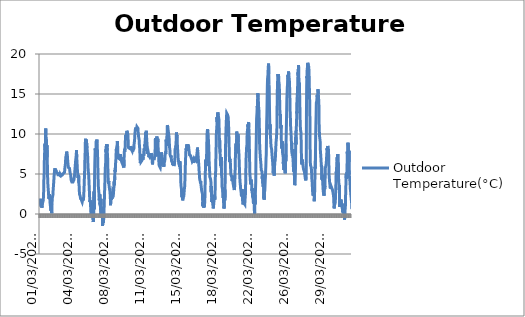
| Category | Outdoor Temperature(°C) |
|---|---|
|  01/03/2022 00:20:09 | 1.6 |
|  01/03/2022 00:50:09 | 1.9 |
|  01/03/2022 01:20:09 | 2 |
|  01/03/2022 01:50:09 | 1.2 |
|  01/03/2022 02:20:09 | 1.7 |
|  01/03/2022 02:50:09 | 0.9 |
|  01/03/2022 03:20:09 | 1.4 |
|  01/03/2022 03:50:09 | 1.4 |
|  01/03/2022 04:20:09 | 0.8 |
|  01/03/2022 04:50:09 | 0.9 |
|  01/03/2022 05:20:09 | 1 |
|  01/03/2022 05:50:09 | 1.1 |
|  01/03/2022 06:20:09 | 1.4 |
|  01/03/2022 06:50:09 | 1.4 |
|  01/03/2022 07:20:09 | 1.5 |
|  01/03/2022 07:50:09 | 1.7 |
|  01/03/2022 08:20:09 | 2.2 |
|  01/03/2022 08:50:09 | 2.9 |
|  01/03/2022 09:20:09 | 4.4 |
|  01/03/2022 09:50:09 | 4.8 |
|  01/03/2022 10:20:09 | 6.6 |
|  01/03/2022 10:50:09 | 7 |
|  01/03/2022 11:20:09 | 8.3 |
|  01/03/2022 11:50:09 | 8.8 |
|  01/03/2022 12:20:09 | 8.8 |
|  01/03/2022 12:50:09 | 8 |
|  01/03/2022 15:54:06 | 9.6 |
|  01/03/2022 16:24:06 | 10.7 |
|  01/03/2022 16:54:06 | 8.3 |
|  01/03/2022 17:24:06 | 9.3 |
|  01/03/2022 17:54:06 | 8.6 |
|  01/03/2022 18:24:06 | 8.1 |
|  01/03/2022 18:54:06 | 8.3 |
|  01/03/2022 19:24:06 | 8.6 |
|  01/03/2022 19:54:06 | 7.1 |
|  01/03/2022 20:24:06 | 5.5 |
|  01/03/2022 20:54:06 | 4.3 |
|  01/03/2022 21:24:06 | 3.7 |
|  01/03/2022 21:54:06 | 3.3 |
|  01/03/2022 22:24:06 | 3 |
|  01/03/2022 22:54:06 | 2.5 |
|  01/03/2022 23:24:06 | 2.2 |
|  01/03/2022 23:54:06 | 1.9 |
|  02/03/2022 00:24:06 | 1.8 |
|  02/03/2022 00:54:06 | 1.8 |
|  02/03/2022 01:24:06 | 2.5 |
|  02/03/2022 01:54:06 | 1.9 |
|  02/03/2022 02:24:06 | 2 |
|  02/03/2022 02:54:06 | 1.2 |
|  02/03/2022 03:24:06 | 1.2 |
|  02/03/2022 03:54:06 | 0.8 |
|  02/03/2022 04:24:06 | 0.8 |
|  02/03/2022 04:54:06 | 0.4 |
|  02/03/2022 05:24:06 | 1.2 |
|  02/03/2022 05:54:06 | 0.7 |
|  02/03/2022 06:24:06 | 0.1 |
|  02/03/2022 06:54:06 | 1.2 |
|  02/03/2022 07:24:06 | 1.5 |
|  02/03/2022 07:54:06 | 2 |
|  02/03/2022 08:24:06 | 1.9 |
|  02/03/2022 08:54:06 | 2 |
|  02/03/2022 09:24:06 | 2.4 |
|  02/03/2022 09:54:06 | 3 |
|  02/03/2022 10:24:06 | 3 |
|  02/03/2022 10:54:06 | 3.7 |
|  02/03/2022 11:24:06 | 4.2 |
|  02/03/2022 11:54:06 | 4.4 |
|  02/03/2022 12:24:06 | 5 |
|  02/03/2022 12:54:06 | 5.2 |
|  02/03/2022 13:24:06 | 5.5 |
|  02/03/2022 13:54:06 | 5.3 |
|  02/03/2022 14:24:06 | 5.7 |
|  02/03/2022 14:54:06 | 5.5 |
|  02/03/2022 15:24:06 | 5.4 |
|  02/03/2022 15:54:06 | 5.5 |
|  02/03/2022 16:24:06 | 5.5 |
|  02/03/2022 16:54:06 | 5.5 |
|  02/03/2022 17:24:06 | 5.4 |
|  02/03/2022 17:54:06 | 5.2 |
|  02/03/2022 18:24:06 | 5.3 |
|  02/03/2022 18:54:06 | 5.3 |
|  02/03/2022 19:24:06 | 5.3 |
|  02/03/2022 19:54:06 | 5.1 |
|  02/03/2022 20:24:06 | 5.1 |
|  02/03/2022 20:54:06 | 5 |
|  02/03/2022 21:24:06 | 4.9 |
|  02/03/2022 21:54:06 | 5 |
|  02/03/2022 22:24:06 | 5 |
|  02/03/2022 22:54:06 | 5 |
|  02/03/2022 23:24:06 | 5 |
|  02/03/2022 23:54:06 | 4.9 |
|  03/03/2022 00:24:06 | 4.9 |
|  03/03/2022 00:54:06 | 5 |
|  03/03/2022 01:24:06 | 4.9 |
|  03/03/2022 01:54:06 | 4.8 |
|  03/03/2022 02:24:06 | 4.8 |
|  03/03/2022 02:54:06 | 5 |
|  03/03/2022 03:24:06 | 5 |
|  03/03/2022 03:54:06 | 5 |
|  03/03/2022 04:24:06 | 5 |
|  03/03/2022 04:54:06 | 4.9 |
|  03/03/2022 05:24:06 | 4.8 |
|  03/03/2022 05:54:06 | 4.9 |
|  03/03/2022 06:24:06 | 4.9 |
|  03/03/2022 06:54:06 | 4.8 |
|  03/03/2022 07:24:06 | 4.8 |
|  03/03/2022 07:54:06 | 4.9 |
|  03/03/2022 08:24:06 | 4.9 |
|  03/03/2022 08:54:06 | 4.8 |
|  03/03/2022 09:24:06 | 4.9 |
|  03/03/2022 09:54:06 | 5 |
|  03/03/2022 10:24:06 | 5.1 |
|  03/03/2022 10:54:06 | 5.1 |
|  03/03/2022 11:24:06 | 5.1 |
|  03/03/2022 11:54:06 | 5 |
|  03/03/2022 12:24:06 | 5.2 |
|  03/03/2022 12:54:06 | 5.2 |
|  03/03/2022 13:24:06 | 5.5 |
|  03/03/2022 13:54:06 | 5.8 |
|  03/03/2022 14:24:06 | 6 |
|  03/03/2022 14:54:06 | 6.2 |
|  03/03/2022 15:24:06 | 6.6 |
|  03/03/2022 15:54:06 | 7.1 |
|  03/03/2022 16:24:06 | 7.1 |
|  03/03/2022 16:54:06 | 7.3 |
|  03/03/2022 17:24:06 | 7.5 |
|  03/03/2022 17:54:06 | 7.8 |
|  03/03/2022 18:24:06 | 7.8 |
|  03/03/2022 18:54:06 | 7.6 |
|  03/03/2022 19:24:06 | 7.5 |
|  03/03/2022 19:54:06 | 7.2 |
|  03/03/2022 20:24:06 | 6.7 |
|  03/03/2022 20:54:06 | 6.4 |
|  03/03/2022 21:24:06 | 6.1 |
|  03/03/2022 21:54:06 | 6 |
|  03/03/2022 22:24:06 | 5.8 |
|  03/03/2022 22:54:06 | 5.9 |
|  03/03/2022 23:24:06 | 5.9 |
|  03/03/2022 23:54:06 | 5.7 |
|  04/03/2022 00:24:06 | 5.8 |
|  04/03/2022 00:54:06 | 5.7 |
|  04/03/2022 01:24:06 | 5.4 |
|  04/03/2022 01:54:06 | 5.3 |
|  04/03/2022 02:24:06 | 5.1 |
|  04/03/2022 02:54:06 | 5 |
|  04/03/2022 03:24:06 | 4.9 |
|  04/03/2022 03:54:06 | 4.9 |
|  04/03/2022 04:24:06 | 4.4 |
|  04/03/2022 04:54:06 | 4.2 |
|  04/03/2022 05:24:06 | 4.2 |
|  04/03/2022 05:54:06 | 4.2 |
|  04/03/2022 06:24:06 | 4 |
|  04/03/2022 06:54:06 | 4.1 |
|  04/03/2022 07:24:06 | 4 |
|  04/03/2022 07:54:06 | 3.9 |
|  04/03/2022 08:24:06 | 4.1 |
|  04/03/2022 08:54:06 | 4 |
|  04/03/2022 09:24:06 | 4.1 |
|  04/03/2022 09:54:06 | 4 |
|  04/03/2022 10:24:06 | 4 |
|  04/03/2022 10:54:06 | 4.1 |
|  04/03/2022 11:24:06 | 4.3 |
|  04/03/2022 11:54:06 | 4.5 |
|  04/03/2022 12:24:06 | 4.7 |
|  04/03/2022 12:54:06 | 5 |
|  04/03/2022 13:24:06 | 5.4 |
|  04/03/2022 13:54:06 | 5.6 |
|  04/03/2022 14:24:06 | 6.1 |
|  04/03/2022 14:54:06 | 6.3 |
|  04/03/2022 15:24:06 | 6.7 |
|  04/03/2022 15:54:06 | 6.9 |
|  04/03/2022 16:24:06 | 7 |
|  04/03/2022 16:54:06 | 7.4 |
|  04/03/2022 17:24:06 | 8 |
|  04/03/2022 17:54:06 | 7.1 |
|  04/03/2022 18:24:06 | 6.7 |
|  04/03/2022 18:54:06 | 6.2 |
|  04/03/2022 19:24:06 | 5.6 |
|  04/03/2022 19:54:06 | 5.3 |
|  04/03/2022 20:24:06 | 4.9 |
|  04/03/2022 20:54:06 | 4.5 |
|  04/03/2022 21:24:06 | 4.5 |
|  04/03/2022 21:54:06 | 4.4 |
|  04/03/2022 22:24:06 | 4.9 |
|  04/03/2022 22:54:06 | 3.9 |
|  04/03/2022 23:24:06 | 3.6 |
|  04/03/2022 23:54:06 | 3.4 |
|  05/03/2022 00:24:06 | 2.5 |
|  05/03/2022 00:54:06 | 2.6 |
|  05/03/2022 01:24:06 | 2.5 |
|  05/03/2022 01:54:06 | 2.3 |
|  05/03/2022 02:24:06 | 2.2 |
|  05/03/2022 02:54:06 | 2 |
|  05/03/2022 03:24:06 | 1.9 |
|  05/03/2022 03:54:06 | 1.8 |
|  05/03/2022 04:24:06 | 1.8 |
|  05/03/2022 04:54:06 | 2 |
|  05/03/2022 05:24:06 | 1.7 |
|  05/03/2022 05:54:06 | 1.8 |
|  05/03/2022 06:24:06 | 1.6 |
|  05/03/2022 06:54:06 | 1.5 |
|  05/03/2022 07:24:06 | 1.4 |
|  05/03/2022 07:54:06 | 1.4 |
|  05/03/2022 08:24:06 | 1.9 |
|  05/03/2022 08:54:06 | 1.8 |
|  05/03/2022 09:24:06 | 1.7 |
|  05/03/2022 09:54:06 | 1.9 |
|  05/03/2022 10:24:06 | 2.1 |
|  05/03/2022 10:54:06 | 2.7 |
|  05/03/2022 11:24:06 | 3.3 |
|  05/03/2022 11:54:06 | 4.1 |
|  05/03/2022 12:24:06 | 4.8 |
|  05/03/2022 12:54:06 | 5.7 |
|  05/03/2022 13:24:06 | 7 |
|  05/03/2022 13:54:06 | 7.6 |
|  05/03/2022 14:24:06 | 8.9 |
|  05/03/2022 14:54:06 | 9.4 |
|  05/03/2022 15:24:06 | 9.3 |
|  05/03/2022 15:54:06 | 8.1 |
|  05/03/2022 16:24:06 | 8.5 |
|  05/03/2022 16:54:06 | 9.3 |
|  05/03/2022 17:24:06 | 9.2 |
|  05/03/2022 17:54:06 | 9.2 |
|  05/03/2022 18:24:06 | 8.2 |
|  05/03/2022 18:54:06 | 8.2 |
|  05/03/2022 19:24:06 | 7.6 |
|  05/03/2022 19:54:06 | 7.2 |
|  05/03/2022 20:24:06 | 6.4 |
|  05/03/2022 20:54:06 | 5.8 |
|  05/03/2022 21:24:06 | 5.3 |
|  05/03/2022 21:54:06 | 5.1 |
|  05/03/2022 22:24:06 | 4.8 |
|  05/03/2022 22:54:06 | 4.2 |
|  05/03/2022 23:24:06 | 3.6 |
|  05/03/2022 23:54:06 | 3 |
|  06/03/2022 00:24:06 | 2.4 |
|  06/03/2022 00:54:06 | 1.7 |
|  06/03/2022 01:24:06 | 1.5 |
|  06/03/2022 01:54:06 | 1.7 |
|  06/03/2022 02:24:06 | 1.5 |
|  06/03/2022 02:54:06 | 1.5 |
|  06/03/2022 03:24:06 | 0.4 |
|  06/03/2022 03:54:06 | 0 |
|  06/03/2022 04:24:06 | 0 |
|  06/03/2022 04:54:06 | 0 |
|  06/03/2022 05:24:06 | 0.2 |
|  06/03/2022 05:54:06 | 1.4 |
|  06/03/2022 06:24:06 | -0.1 |
|  06/03/2022 06:54:06 | -0.5 |
|  06/03/2022 07:24:06 | -0.4 |
|  06/03/2022 07:54:06 | -0.2 |
|  06/03/2022 08:24:06 | -0.3 |
|  06/03/2022 08:54:06 | -0.7 |
|  06/03/2022 09:24:06 | -1 |
|  06/03/2022 09:54:06 | -0.4 |
|  06/03/2022 10:24:06 | 0.2 |
|  06/03/2022 10:54:06 | 2.8 |
|  06/03/2022 11:24:06 | 0.6 |
|  06/03/2022 11:54:06 | 2.3 |
|  06/03/2022 12:24:06 | 4.8 |
|  06/03/2022 12:54:06 | 6.3 |
|  06/03/2022 13:24:06 | 7.3 |
|  06/03/2022 13:54:06 | 8.2 |
|  06/03/2022 14:24:06 | 8.3 |
|  06/03/2022 14:54:06 | 7.6 |
|  06/03/2022 15:24:06 | 7.8 |
|  06/03/2022 15:54:06 | 7.3 |
|  06/03/2022 16:24:06 | 9.1 |
|  06/03/2022 16:54:06 | 9.1 |
|  06/03/2022 17:24:06 | 9.2 |
|  06/03/2022 17:54:06 | 9.3 |
|  06/03/2022 18:24:06 | 8.8 |
|  06/03/2022 18:54:06 | 8.7 |
|  06/03/2022 19:24:06 | 7.6 |
|  06/03/2022 19:54:06 | 6.5 |
|  06/03/2022 20:24:06 | 5.3 |
|  06/03/2022 20:54:06 | 4.1 |
|  06/03/2022 21:24:06 | 3.4 |
|  06/03/2022 21:54:06 | 3.1 |
|  06/03/2022 22:24:06 | 3.1 |
|  06/03/2022 22:54:06 | 2.5 |
|  06/03/2022 23:24:06 | 1.7 |
|  06/03/2022 23:54:06 | 2 |
|  07/03/2022 00:24:06 | 2.3 |
|  07/03/2022 00:54:06 | 2.5 |
|  07/03/2022 01:24:06 | 1.2 |
|  07/03/2022 01:54:06 | 1.4 |
|  07/03/2022 02:24:06 | 0.5 |
|  07/03/2022 02:54:06 | 1.5 |
|  07/03/2022 03:24:06 | 1.9 |
|  07/03/2022 03:54:06 | -0.4 |
|  07/03/2022 04:24:06 | 0.5 |
|  07/03/2022 04:54:06 | -0.3 |
|  07/03/2022 05:24:06 | 0.7 |
|  07/03/2022 05:54:06 | 0.9 |
|  07/03/2022 06:24:06 | 0.8 |
|  07/03/2022 06:54:06 | -0.4 |
|  07/03/2022 07:24:06 | -1.5 |
|  07/03/2022 07:54:06 | -0.8 |
|  07/03/2022 08:24:06 | -0.6 |
|  07/03/2022 08:54:06 | -1.1 |
|  07/03/2022 09:24:06 | -1 |
|  07/03/2022 09:54:06 | -0.7 |
|  07/03/2022 10:24:06 | -0.3 |
|  07/03/2022 10:54:06 | 0.5 |
|  07/03/2022 11:24:06 | 1.5 |
|  07/03/2022 11:54:06 | 2.1 |
|  07/03/2022 12:24:06 | 3.3 |
|  07/03/2022 12:54:06 | 4 |
|  07/03/2022 13:24:06 | 5.1 |
|  07/03/2022 13:54:06 | 5.8 |
|  07/03/2022 14:24:06 | 6.2 |
|  07/03/2022 14:54:06 | 6.5 |
|  07/03/2022 15:24:06 | 8.1 |
|  07/03/2022 15:54:06 | 7.7 |
|  07/03/2022 16:24:06 | 8.5 |
|  07/03/2022 16:54:06 | 8.7 |
|  07/03/2022 17:24:06 | 8.4 |
|  07/03/2022 17:54:06 | 8.7 |
|  07/03/2022 18:24:06 | 7.9 |
|  07/03/2022 18:54:06 | 7.5 |
|  07/03/2022 19:24:06 | 7 |
|  07/03/2022 19:54:06 | 5.8 |
|  07/03/2022 20:24:06 | 4.7 |
|  07/03/2022 20:54:06 | 4.2 |
|  07/03/2022 21:24:06 | 3.8 |
|  07/03/2022 21:54:06 | 4.1 |
|  07/03/2022 22:24:06 | 3.8 |
|  07/03/2022 22:54:06 | 3.7 |
|  07/03/2022 23:24:06 | 3.3 |
|  07/03/2022 23:54:06 | 3.3 |
|  08/03/2022 00:24:06 | 3.2 |
|  08/03/2022 00:54:06 | 2.8 |
|  08/03/2022 01:24:06 | 2.4 |
|  08/03/2022 01:54:06 | 1.9 |
|  08/03/2022 02:24:06 | 1.1 |
|  08/03/2022 02:54:06 | 2 |
|  08/03/2022 03:24:06 | 2.4 |
|  08/03/2022 03:54:06 | 2.4 |
|  08/03/2022 04:24:06 | 1.8 |
|  08/03/2022 04:54:06 | 2.2 |
|  08/03/2022 05:24:06 | 2.2 |
|  08/03/2022 05:54:06 | 1.9 |
|  08/03/2022 06:24:06 | 2.3 |
|  08/03/2022 06:54:06 | 2.3 |
|  08/03/2022 07:24:06 | 2.9 |
|  08/03/2022 07:54:06 | 2.9 |
|  08/03/2022 08:24:06 | 2.8 |
|  08/03/2022 08:54:06 | 2.8 |
|  08/03/2022 09:24:06 | 2.7 |
|  08/03/2022 09:54:06 | 2.7 |
|  08/03/2022 10:24:06 | 3.4 |
|  08/03/2022 10:54:06 | 4.1 |
|  08/03/2022 11:24:06 | 3.6 |
|  08/03/2022 11:54:06 | 3.7 |
|  08/03/2022 12:24:06 | 4.7 |
|  08/03/2022 12:54:06 | 5.5 |
|  08/03/2022 13:24:06 | 5.3 |
|  08/03/2022 13:54:06 | 5.9 |
|  08/03/2022 14:24:06 | 6.4 |
|  08/03/2022 14:54:06 | 6.7 |
|  08/03/2022 15:24:06 | 7.3 |
|  08/03/2022 15:54:06 | 8.1 |
|  08/03/2022 16:24:06 | 7.9 |
|  08/03/2022 16:54:06 | 8.3 |
|  08/03/2022 17:24:06 | 8.4 |
|  08/03/2022 17:54:06 | 8.6 |
|  08/03/2022 18:24:06 | 9.1 |
|  08/03/2022 18:54:06 | 8.9 |
|  08/03/2022 19:24:06 | 8.1 |
|  08/03/2022 19:54:06 | 7.4 |
|  08/03/2022 20:24:06 | 7.3 |
|  08/03/2022 20:54:06 | 7 |
|  08/03/2022 21:24:06 | 7.1 |
|  08/03/2022 21:54:06 | 7.1 |
|  08/03/2022 22:24:06 | 7.1 |
|  08/03/2022 22:54:06 | 7 |
|  08/03/2022 23:24:06 | 6.9 |
|  08/03/2022 23:54:06 | 6.9 |
|  09/03/2022 00:24:06 | 7.3 |
|  09/03/2022 00:54:06 | 7 |
|  09/03/2022 01:24:06 | 7.2 |
|  09/03/2022 01:54:06 | 7.5 |
|  09/03/2022 02:24:06 | 7.2 |
|  09/03/2022 02:54:06 | 6.9 |
|  09/03/2022 03:24:06 | 7.1 |
|  09/03/2022 03:54:06 | 6.7 |
|  09/03/2022 04:24:06 | 6.6 |
|  09/03/2022 04:54:06 | 6.5 |
|  09/03/2022 05:24:06 | 6.5 |
|  09/03/2022 05:54:06 | 6.5 |
|  09/03/2022 06:24:06 | 6.3 |
|  09/03/2022 06:54:06 | 6.4 |
|  09/03/2022 07:24:06 | 6.5 |
|  09/03/2022 07:54:06 | 6.3 |
|  09/03/2022 08:24:06 | 6.4 |
|  09/03/2022 08:54:06 | 6.5 |
|  09/03/2022 09:24:06 | 6.2 |
|  09/03/2022 09:54:06 | 5.8 |
|  09/03/2022 10:24:06 | 6.8 |
|  09/03/2022 10:54:06 | 7.5 |
|  09/03/2022 11:24:06 | 8.1 |
|  09/03/2022 11:54:06 | 7.8 |
|  09/03/2022 12:24:06 | 7.7 |
|  09/03/2022 12:54:06 | 8.2 |
|  09/03/2022 13:24:06 | 8.3 |
|  09/03/2022 13:54:06 | 9.7 |
|  09/03/2022 14:24:06 | 9.9 |
|  09/03/2022 14:54:06 | 9.8 |
|  09/03/2022 15:24:06 | 9.6 |
|  09/03/2022 15:54:06 | 9.9 |
|  09/03/2022 16:24:06 | 10.1 |
|  09/03/2022 16:54:06 | 10.4 |
|  09/03/2022 17:24:06 | 10.5 |
|  09/03/2022 17:54:06 | 10.5 |
|  09/03/2022 18:24:06 | 10.4 |
|  09/03/2022 18:54:06 | 10.1 |
|  09/03/2022 19:24:06 | 10 |
|  09/03/2022 19:54:06 | 9.8 |
|  09/03/2022 20:24:06 | 8.6 |
|  09/03/2022 20:54:06 | 8.3 |
|  09/03/2022 21:24:06 | 8.3 |
|  09/03/2022 21:54:06 | 8.3 |
|  09/03/2022 22:24:06 | 8.3 |
|  09/03/2022 22:54:06 | 8.4 |
|  09/03/2022 23:24:06 | 8.2 |
|  09/03/2022 23:54:06 | 8.2 |
|  10/03/2022 00:24:06 | 8.2 |
|  10/03/2022 00:54:06 | 8.3 |
|  10/03/2022 01:24:06 | 8.3 |
|  10/03/2022 01:54:06 | 8.3 |
|  10/03/2022 02:24:06 | 8.5 |
|  10/03/2022 02:54:06 | 8.6 |
|  10/03/2022 03:24:06 | 8.1 |
|  10/03/2022 03:54:06 | 8.1 |
|  10/03/2022 04:24:06 | 8.2 |
|  10/03/2022 04:54:06 | 8 |
|  10/03/2022 05:24:06 | 7.9 |
|  10/03/2022 05:54:06 | 8.1 |
|  10/03/2022 06:24:06 | 8.2 |
|  10/03/2022 06:54:06 | 8.1 |
|  10/03/2022 07:24:06 | 8 |
|  10/03/2022 07:54:06 | 8.1 |
|  10/03/2022 08:24:06 | 8 |
|  10/03/2022 08:54:06 | 8.1 |
|  10/03/2022 09:24:06 | 8 |
|  10/03/2022 09:54:06 | 8.2 |
|  10/03/2022 10:24:06 | 8.8 |
|  10/03/2022 10:54:06 | 9 |
|  10/03/2022 11:24:06 | 9.2 |
|  10/03/2022 11:54:06 | 9.7 |
|  10/03/2022 12:24:06 | 9.8 |
|  10/03/2022 12:54:06 | 10.4 |
|  10/03/2022 13:24:06 | 10.6 |
|  10/03/2022 13:54:06 | 10.8 |
|  10/03/2022 14:24:06 | 10.5 |
|  10/03/2022 14:54:06 | 10.7 |
|  10/03/2022 15:24:06 | 10.4 |
|  10/03/2022 15:54:06 | 10.6 |
|  10/03/2022 16:24:06 | 10.5 |
|  10/03/2022 16:54:06 | 10.9 |
|  10/03/2022 17:24:06 | 10.9 |
|  10/03/2022 17:54:06 | 11 |
|  10/03/2022 18:24:06 | 10.9 |
|  10/03/2022 18:54:06 | 10.8 |
|  10/03/2022 19:24:06 | 10.7 |
|  10/03/2022 19:54:06 | 10.2 |
|  10/03/2022 20:24:06 | 10 |
|  10/03/2022 20:54:06 | 9.7 |
|  10/03/2022 21:24:06 | 9.7 |
|  10/03/2022 21:54:06 | 9.8 |
|  10/03/2022 22:24:06 | 9.2 |
|  10/03/2022 22:54:06 | 8.6 |
|  10/03/2022 23:24:06 | 8.3 |
|  10/03/2022 23:54:06 | 7.8 |
|  11/03/2022 00:24:06 | 7 |
|  11/03/2022 00:54:06 | 6.4 |
|  11/03/2022 01:24:06 | 6.5 |
|  11/03/2022 01:54:06 | 6.7 |
|  11/03/2022 02:24:06 | 6.5 |
|  11/03/2022 02:54:06 | 6.4 |
|  11/03/2022 03:24:06 | 6.5 |
|  11/03/2022 03:54:06 | 6.6 |
|  11/03/2022 04:24:06 | 6.5 |
|  11/03/2022 04:54:06 | 6.7 |
|  11/03/2022 05:24:06 | 6.6 |
|  11/03/2022 05:54:06 | 7.5 |
|  11/03/2022 06:24:06 | 7.1 |
|  11/03/2022 06:54:06 | 7 |
|  11/03/2022 07:24:06 | 6.8 |
|  11/03/2022 07:54:06 | 7.1 |
|  11/03/2022 08:24:06 | 7.5 |
|  11/03/2022 08:54:06 | 7.6 |
|  11/03/2022 09:24:06 | 7.3 |
|  11/03/2022 09:54:06 | 7.9 |
|  11/03/2022 10:24:06 | 8.2 |
|  11/03/2022 10:54:06 | 7.9 |
|  11/03/2022 11:24:06 | 8.1 |
|  11/03/2022 11:54:06 | 8.7 |
|  11/03/2022 12:24:06 | 8.5 |
|  11/03/2022 12:54:06 | 9.1 |
|  11/03/2022 13:24:06 | 10.2 |
|  11/03/2022 13:54:06 | 10.1 |
|  11/03/2022 14:24:06 | 9.2 |
|  11/03/2022 14:54:06 | 9.5 |
|  11/03/2022 15:24:06 | 10.4 |
|  11/03/2022 15:54:06 | 9.7 |
|  11/03/2022 16:24:06 | 9.2 |
|  11/03/2022 16:54:06 | 8.8 |
|  11/03/2022 17:24:06 | 8.4 |
|  11/03/2022 17:54:06 | 7.9 |
|  11/03/2022 18:24:06 | 7.5 |
|  11/03/2022 18:54:06 | 7.4 |
|  11/03/2022 19:24:06 | 7.6 |
|  11/03/2022 19:54:06 | 7.7 |
|  11/03/2022 20:24:06 | 7.6 |
|  11/03/2022 20:54:06 | 7.4 |
|  11/03/2022 21:24:06 | 7.1 |
|  11/03/2022 21:54:06 | 7.3 |
|  11/03/2022 22:24:06 | 7.3 |
|  11/03/2022 22:54:06 | 7.2 |
|  11/03/2022 23:24:06 | 7.2 |
|  11/03/2022 23:54:06 | 7.1 |
|  12/03/2022 00:24:06 | 7.2 |
|  12/03/2022 00:54:06 | 7.2 |
|  12/03/2022 01:24:06 | 7.2 |
|  12/03/2022 01:54:06 | 7.3 |
|  12/03/2022 02:24:06 | 7.3 |
|  12/03/2022 02:54:06 | 7.6 |
|  12/03/2022 03:24:06 | 7.6 |
|  12/03/2022 03:54:06 | 7.4 |
|  12/03/2022 04:24:06 | 7.2 |
|  12/03/2022 04:54:06 | 7 |
|  12/03/2022 05:24:06 | 6.6 |
|  12/03/2022 05:54:06 | 6.2 |
|  12/03/2022 06:24:06 | 6.4 |
|  12/03/2022 06:54:06 | 6.9 |
|  12/03/2022 07:24:06 | 7.1 |
|  12/03/2022 07:54:06 | 6.9 |
|  12/03/2022 08:24:06 | 7 |
|  12/03/2022 08:54:06 | 7 |
|  12/03/2022 09:24:06 | 6.8 |
|  12/03/2022 09:54:06 | 7 |
|  12/03/2022 10:24:06 | 6.9 |
|  12/03/2022 10:54:06 | 7 |
|  12/03/2022 11:24:06 | 7.3 |
|  12/03/2022 11:54:06 | 7.7 |
|  12/03/2022 12:24:06 | 8.2 |
|  12/03/2022 12:54:06 | 9.5 |
|  12/03/2022 13:24:06 | 9.4 |
|  12/03/2022 13:54:06 | 7.9 |
|  12/03/2022 14:24:06 | 7.6 |
|  12/03/2022 14:54:06 | 7.2 |
|  12/03/2022 15:24:06 | 7.3 |
|  12/03/2022 15:54:06 | 8.6 |
|  12/03/2022 16:24:06 | 9.7 |
|  12/03/2022 16:54:06 | 9.1 |
|  12/03/2022 17:24:06 | 8.6 |
|  12/03/2022 17:54:06 | 8.4 |
|  12/03/2022 18:24:06 | 9.4 |
|  12/03/2022 18:54:06 | 9 |
|  12/03/2022 19:24:06 | 8.3 |
|  12/03/2022 19:54:06 | 8.4 |
|  12/03/2022 20:24:06 | 7.5 |
|  12/03/2022 20:54:06 | 6.9 |
|  12/03/2022 21:24:06 | 6.2 |
|  12/03/2022 21:54:06 | 6.1 |
|  12/03/2022 22:24:06 | 6 |
|  12/03/2022 22:54:06 | 5.9 |
|  12/03/2022 23:24:06 | 6 |
|  12/03/2022 23:54:06 | 5.9 |
|  13/03/2022 00:24:06 | 5.8 |
|  13/03/2022 00:54:06 | 5.8 |
|  13/03/2022 01:24:06 | 6.3 |
|  13/03/2022 01:54:06 | 6.5 |
|  13/03/2022 02:24:06 | 7.5 |
|  13/03/2022 02:54:06 | 7.7 |
|  13/03/2022 03:24:06 | 7.8 |
|  13/03/2022 03:54:06 | 7.5 |
|  13/03/2022 04:24:06 | 7.4 |
|  13/03/2022 04:54:06 | 7.1 |
|  13/03/2022 05:24:06 | 7.2 |
|  13/03/2022 05:54:06 | 7.2 |
|  13/03/2022 06:24:06 | 6.8 |
|  13/03/2022 06:54:06 | 6.5 |
|  13/03/2022 07:24:06 | 6.5 |
|  13/03/2022 07:54:06 | 6.4 |
|  13/03/2022 08:24:06 | 6.2 |
|  13/03/2022 08:54:06 | 5.9 |
|  13/03/2022 09:24:06 | 6.3 |
|  13/03/2022 09:54:06 | 6.4 |
|  13/03/2022 10:24:06 | 6.4 |
|  13/03/2022 10:54:06 | 6.4 |
|  13/03/2022 11:24:06 | 6.7 |
|  13/03/2022 11:54:06 | 7.3 |
|  13/03/2022 12:24:06 | 7.4 |
|  13/03/2022 12:54:06 | 7.7 |
|  13/03/2022 13:24:06 | 7.5 |
|  13/03/2022 13:54:06 | 7.9 |
|  13/03/2022 14:24:06 | 9.3 |
|  13/03/2022 14:54:06 | 9.1 |
|  13/03/2022 15:24:06 | 9.2 |
|  13/03/2022 15:54:06 | 9.2 |
|  13/03/2022 16:24:06 | 8.5 |
|  13/03/2022 16:54:06 | 10.1 |
|  13/03/2022 17:24:06 | 11.1 |
|  13/03/2022 17:54:06 | 11.2 |
|  13/03/2022 18:24:06 | 10.9 |
|  13/03/2022 18:54:06 | 11 |
|  13/03/2022 19:24:06 | 10.4 |
|  13/03/2022 19:54:06 | 10.2 |
|  13/03/2022 20:24:06 | 10.1 |
|  13/03/2022 20:54:06 | 9.8 |
|  13/03/2022 21:24:06 | 9.6 |
|  13/03/2022 21:54:06 | 9.1 |
|  13/03/2022 22:24:06 | 8.4 |
|  13/03/2022 22:54:06 | 8.4 |
|  13/03/2022 23:24:06 | 8 |
|  13/03/2022 23:54:06 | 7.4 |
|  14/03/2022 00:24:06 | 7.3 |
|  14/03/2022 00:54:06 | 7.3 |
|  14/03/2022 01:24:06 | 7.1 |
|  14/03/2022 01:54:06 | 7.3 |
|  14/03/2022 02:24:06 | 7.1 |
|  14/03/2022 02:54:06 | 7.1 |
|  14/03/2022 03:24:06 | 6.6 |
|  14/03/2022 03:54:06 | 6.6 |
|  14/03/2022 04:24:06 | 6.6 |
|  14/03/2022 04:54:06 | 6.5 |
|  14/03/2022 05:24:06 | 6.4 |
|  14/03/2022 05:54:06 | 6.1 |
|  14/03/2022 06:24:06 | 6.3 |
|  14/03/2022 06:54:06 | 6.6 |
|  14/03/2022 07:24:06 | 6.4 |
|  14/03/2022 07:54:06 | 6.4 |
|  14/03/2022 08:24:06 | 6.5 |
|  14/03/2022 08:54:06 | 6 |
|  14/03/2022 09:24:06 | 6.1 |
|  14/03/2022 09:54:06 | 6.1 |
|  14/03/2022 10:24:06 | 6.4 |
|  14/03/2022 10:54:06 | 6.7 |
|  14/03/2022 11:24:06 | 7.2 |
|  14/03/2022 11:54:06 | 8.2 |
|  14/03/2022 12:24:06 | 8.2 |
|  14/03/2022 12:54:06 | 8 |
|  14/03/2022 13:24:06 | 8.5 |
|  14/03/2022 13:54:06 | 8.8 |
|  14/03/2022 14:24:06 | 9.3 |
|  14/03/2022 14:54:06 | 10.2 |
|  14/03/2022 15:24:06 | 9.5 |
|  14/03/2022 15:54:06 | 9.9 |
|  14/03/2022 16:24:06 | 9.7 |
|  14/03/2022 16:54:06 | 9.1 |
|  14/03/2022 17:24:06 | 8.2 |
|  14/03/2022 17:54:06 | 8 |
|  14/03/2022 18:24:06 | 7.5 |
|  14/03/2022 18:54:06 | 7 |
|  14/03/2022 19:24:06 | 6.8 |
|  14/03/2022 19:54:06 | 6.6 |
|  14/03/2022 20:24:06 | 6.3 |
|  14/03/2022 20:54:06 | 6.4 |
|  14/03/2022 21:24:06 | 6.2 |
|  14/03/2022 21:54:06 | 6.1 |
|  14/03/2022 22:24:06 | 5.9 |
|  14/03/2022 22:54:06 | 6.6 |
|  14/03/2022 23:24:06 | 6.7 |
|  14/03/2022 23:54:06 | 6.5 |
|  15/03/2022 00:24:06 | 5.5 |
|  15/03/2022 00:54:06 | 4.8 |
|  15/03/2022 01:24:06 | 3.9 |
|  15/03/2022 01:54:06 | 3.5 |
|  15/03/2022 02:24:06 | 3.3 |
|  15/03/2022 02:54:06 | 3.1 |
|  15/03/2022 03:24:06 | 3.2 |
|  15/03/2022 03:54:06 | 2.1 |
|  15/03/2022 04:24:06 | 3 |
|  15/03/2022 04:54:06 | 2.7 |
|  15/03/2022 05:24:06 | 1.9 |
|  15/03/2022 05:54:06 | 1.7 |
|  15/03/2022 06:24:06 | 2 |
|  15/03/2022 06:54:06 | 2.1 |
|  15/03/2022 07:24:06 | 2 |
|  15/03/2022 07:54:06 | 2.1 |
|  15/03/2022 08:24:06 | 2.2 |
|  15/03/2022 08:54:06 | 2.3 |
|  15/03/2022 09:24:06 | 2.9 |
|  15/03/2022 09:54:06 | 3.2 |
|  15/03/2022 10:24:06 | 3.4 |
|  15/03/2022 10:54:06 | 4 |
|  15/03/2022 11:24:06 | 4.7 |
|  15/03/2022 11:54:06 | 5.7 |
|  15/03/2022 12:24:06 | 6.5 |
|  15/03/2022 12:54:06 | 7.3 |
|  15/03/2022 13:24:06 | 7.9 |
|  15/03/2022 13:54:06 | 8.2 |
|  15/03/2022 14:24:06 | 8.3 |
|  15/03/2022 14:54:06 | 7.9 |
|  15/03/2022 15:24:06 | 7.8 |
|  15/03/2022 15:54:06 | 8.7 |
|  15/03/2022 16:24:06 | 8.2 |
|  15/03/2022 16:54:06 | 8.2 |
|  15/03/2022 17:24:06 | 8.4 |
|  15/03/2022 17:54:06 | 8.7 |
|  15/03/2022 18:24:06 | 8.7 |
|  15/03/2022 18:54:06 | 8.6 |
|  15/03/2022 19:24:06 | 8.6 |
|  15/03/2022 19:54:06 | 8.4 |
|  15/03/2022 20:24:06 | 8.1 |
|  15/03/2022 20:54:06 | 7.9 |
|  15/03/2022 21:24:06 | 7.7 |
|  15/03/2022 21:54:06 | 7.4 |
|  15/03/2022 22:24:06 | 7.4 |
|  15/03/2022 22:54:06 | 7.5 |
|  15/03/2022 23:24:06 | 7.5 |
|  15/03/2022 23:54:06 | 7.3 |
|  16/03/2022 00:24:06 | 7.3 |
|  16/03/2022 00:54:06 | 7.2 |
|  16/03/2022 01:24:06 | 7.1 |
|  16/03/2022 01:54:06 | 7 |
|  16/03/2022 02:24:06 | 7.1 |
|  16/03/2022 02:54:06 | 7 |
|  16/03/2022 03:24:06 | 6.8 |
|  16/03/2022 03:54:06 | 6.9 |
|  16/03/2022 04:24:06 | 6.6 |
|  16/03/2022 04:54:06 | 6.5 |
|  16/03/2022 05:24:06 | 6.7 |
|  16/03/2022 05:54:06 | 6.7 |
|  16/03/2022 06:24:06 | 6.8 |
|  16/03/2022 06:54:06 | 6.7 |
|  16/03/2022 07:24:06 | 6.4 |
|  16/03/2022 07:54:06 | 6.3 |
|  16/03/2022 08:24:06 | 6.6 |
|  16/03/2022 08:54:06 | 6.6 |
|  16/03/2022 09:24:06 | 6.7 |
|  16/03/2022 09:54:06 | 6.6 |
|  16/03/2022 10:24:06 | 6.7 |
|  16/03/2022 10:54:06 | 6.9 |
|  16/03/2022 11:24:06 | 7 |
|  16/03/2022 11:54:06 | 6.9 |
|  16/03/2022 12:24:06 | 7 |
|  16/03/2022 12:54:06 | 7 |
|  16/03/2022 13:24:06 | 6.7 |
|  16/03/2022 13:54:06 | 6.8 |
|  16/03/2022 14:24:06 | 6.9 |
|  16/03/2022 14:54:06 | 7 |
|  16/03/2022 15:24:06 | 7.4 |
|  16/03/2022 15:54:06 | 7.5 |
|  16/03/2022 16:24:06 | 7.9 |
|  16/03/2022 16:54:06 | 8.3 |
|  16/03/2022 17:24:06 | 7.9 |
|  16/03/2022 17:54:06 | 7.7 |
|  16/03/2022 18:24:06 | 7.8 |
|  16/03/2022 18:54:06 | 7.8 |
|  16/03/2022 19:24:06 | 7.6 |
|  16/03/2022 19:54:06 | 6.2 |
|  16/03/2022 20:24:06 | 5.8 |
|  16/03/2022 20:54:06 | 5.3 |
|  16/03/2022 21:24:06 | 4.9 |
|  16/03/2022 21:54:06 | 4.5 |
|  16/03/2022 22:24:06 | 4.3 |
|  16/03/2022 22:54:06 | 4.2 |
|  16/03/2022 23:24:06 | 4.1 |
|  16/03/2022 23:54:06 | 3.9 |
|  17/03/2022 00:24:06 | 4.1 |
|  17/03/2022 00:54:06 | 3.8 |
|  17/03/2022 01:24:06 | 3.6 |
|  17/03/2022 01:54:06 | 3.6 |
|  17/03/2022 02:24:06 | 3.6 |
|  17/03/2022 02:54:06 | 2.9 |
|  17/03/2022 03:24:06 | 2.8 |
|  17/03/2022 03:54:06 | 3 |
|  17/03/2022 04:24:06 | 2.6 |
|  17/03/2022 04:54:06 | 2.4 |
|  17/03/2022 05:24:06 | 1 |
|  17/03/2022 05:54:06 | 1.5 |
|  17/03/2022 06:24:06 | 1.4 |
|  17/03/2022 06:54:06 | 0.9 |
|  17/03/2022 07:24:06 | 1.1 |
|  17/03/2022 07:54:06 | 0.8 |
|  17/03/2022 08:24:06 | 0.8 |
|  17/03/2022 08:54:06 | 1.1 |
|  17/03/2022 09:24:06 | 0.9 |
|  17/03/2022 09:54:06 | 1.3 |
|  17/03/2022 10:24:06 | 1.7 |
|  17/03/2022 10:54:06 | 3.1 |
|  17/03/2022 11:24:06 | 4.5 |
|  17/03/2022 11:54:06 | 6 |
|  17/03/2022 12:24:06 | 6.8 |
|  17/03/2022 12:54:06 | 6.3 |
|  17/03/2022 13:24:06 | 6 |
|  17/03/2022 13:54:06 | 6.3 |
|  17/03/2022 14:24:06 | 6.5 |
|  17/03/2022 14:54:06 | 8.4 |
|  17/03/2022 15:24:06 | 8.5 |
|  17/03/2022 15:54:06 | 10.2 |
|  17/03/2022 16:24:06 | 10.4 |
|  17/03/2022 16:54:06 | 10.6 |
|  17/03/2022 17:24:06 | 10.3 |
|  17/03/2022 17:54:06 | 10.1 |
|  17/03/2022 18:24:06 | 9.8 |
|  17/03/2022 18:54:06 | 9.7 |
|  17/03/2022 19:24:06 | 8.7 |
|  17/03/2022 19:54:06 | 8 |
|  17/03/2022 20:24:06 | 6.9 |
|  17/03/2022 20:54:06 | 6.1 |
|  17/03/2022 21:24:06 | 5.8 |
|  17/03/2022 21:54:06 | 5.2 |
|  17/03/2022 22:24:06 | 4.6 |
|  17/03/2022 22:54:06 | 4.7 |
|  17/03/2022 23:24:06 | 4.7 |
|  17/03/2022 23:54:06 | 4.4 |
|  18/03/2022 00:24:06 | 4.3 |
|  18/03/2022 00:54:06 | 4 |
|  18/03/2022 01:24:06 | 2.7 |
|  18/03/2022 01:54:06 | 3.5 |
|  18/03/2022 02:24:06 | 2.4 |
|  18/03/2022 02:54:06 | 1.5 |
|  18/03/2022 03:24:06 | 1.9 |
|  18/03/2022 03:54:06 | 2.1 |
|  18/03/2022 04:24:06 | 2.2 |
|  18/03/2022 04:54:06 | 1.4 |
|  18/03/2022 05:24:06 | 1.6 |
|  18/03/2022 05:54:06 | 1.1 |
|  18/03/2022 06:24:06 | 0.7 |
|  18/03/2022 06:54:06 | 0.9 |
|  18/03/2022 07:24:06 | 1.2 |
|  18/03/2022 07:54:06 | 1.5 |
|  18/03/2022 08:24:06 | 1.7 |
|  18/03/2022 08:54:06 | 2.1 |
|  18/03/2022 09:24:06 | 2.4 |
|  18/03/2022 09:54:06 | 1.8 |
|  18/03/2022 10:24:06 | 2.2 |
|  18/03/2022 10:54:06 | 3 |
|  18/03/2022 11:24:06 | 4.6 |
|  18/03/2022 11:54:06 | 5 |
|  18/03/2022 12:24:06 | 6 |
|  18/03/2022 12:54:06 | 7.8 |
|  18/03/2022 13:24:06 | 8.6 |
|  18/03/2022 13:54:06 | 10.2 |
|  18/03/2022 14:24:06 | 10.5 |
|  18/03/2022 14:54:06 | 10.7 |
|  18/03/2022 15:24:06 | 12.1 |
|  18/03/2022 15:54:06 | 11.5 |
|  18/03/2022 16:24:06 | 12.5 |
|  18/03/2022 16:54:06 | 12.6 |
|  18/03/2022 17:24:06 | 12.7 |
|  18/03/2022 17:54:06 | 12.6 |
|  18/03/2022 18:24:06 | 12.3 |
|  18/03/2022 18:54:06 | 12.3 |
|  18/03/2022 19:24:06 | 12.3 |
|  18/03/2022 19:54:06 | 11.8 |
|  18/03/2022 20:24:06 | 10.7 |
|  18/03/2022 20:54:06 | 9.3 |
|  18/03/2022 21:24:06 | 9.5 |
|  18/03/2022 21:54:06 | 9.4 |
|  18/03/2022 22:24:06 | 7.7 |
|  18/03/2022 22:54:06 | 7.4 |
|  18/03/2022 23:24:06 | 6.6 |
|  18/03/2022 23:54:06 | 6.8 |
|  19/03/2022 00:24:06 | 6 |
|  19/03/2022 00:54:06 | 5.9 |
|  19/03/2022 01:24:06 | 7.1 |
|  19/03/2022 01:54:06 | 5 |
|  19/03/2022 02:24:06 | 5 |
|  19/03/2022 02:54:06 | 4.5 |
|  19/03/2022 03:24:06 | 3.4 |
|  19/03/2022 03:54:06 | 3.4 |
|  19/03/2022 04:24:06 | 3.1 |
|  19/03/2022 04:54:06 | 3.3 |
|  19/03/2022 05:24:06 | 2.8 |
|  19/03/2022 05:54:06 | 2 |
|  19/03/2022 06:24:06 | 2.9 |
|  19/03/2022 06:54:06 | 1.4 |
|  19/03/2022 07:24:06 | 2.5 |
|  19/03/2022 07:54:06 | 0.7 |
|  19/03/2022 08:24:06 | 1 |
|  19/03/2022 08:54:06 | 2 |
|  19/03/2022 09:24:06 | 3.1 |
|  19/03/2022 09:54:06 | 1.7 |
|  19/03/2022 10:24:06 | 3.1 |
|  19/03/2022 10:54:06 | 4.6 |
|  19/03/2022 11:24:06 | 7.8 |
|  19/03/2022 11:54:06 | 9 |
|  19/03/2022 12:24:06 | 10.1 |
|  19/03/2022 12:54:06 | 10.8 |
|  19/03/2022 13:24:06 | 11.5 |
|  19/03/2022 13:54:06 | 12.1 |
|  19/03/2022 14:24:06 | 12.6 |
|  19/03/2022 14:54:06 | 12.5 |
|  19/03/2022 15:24:06 | 12.6 |
|  19/03/2022 15:54:06 | 12.7 |
|  19/03/2022 16:24:06 | 12.4 |
|  19/03/2022 16:54:06 | 12.4 |
|  19/03/2022 17:24:06 | 12.3 |
|  19/03/2022 17:54:06 | 12.1 |
|  19/03/2022 18:24:06 | 11.6 |
|  19/03/2022 18:54:06 | 11 |
|  19/03/2022 19:24:06 | 10 |
|  19/03/2022 19:54:06 | 8.9 |
|  19/03/2022 20:24:06 | 7.7 |
|  19/03/2022 20:54:06 | 6.9 |
|  19/03/2022 21:24:06 | 6.5 |
|  19/03/2022 21:54:06 | 6.9 |
|  19/03/2022 22:24:06 | 6.7 |
|  19/03/2022 22:54:06 | 6.8 |
|  19/03/2022 23:24:06 | 6.2 |
|  19/03/2022 23:54:06 | 5.3 |
|  20/03/2022 00:24:06 | 4.9 |
|  20/03/2022 00:54:06 | 5 |
|  20/03/2022 01:24:06 | 4.9 |
|  20/03/2022 01:54:06 | 4.8 |
|  20/03/2022 02:24:06 | 4.6 |
|  20/03/2022 02:54:06 | 4.3 |
|  20/03/2022 03:24:06 | 4.1 |
|  20/03/2022 03:54:06 | 4.4 |
|  20/03/2022 04:24:06 | 4.8 |
|  20/03/2022 04:54:06 | 4.5 |
|  20/03/2022 05:24:06 | 3.9 |
|  20/03/2022 05:54:06 | 3.7 |
|  20/03/2022 06:24:06 | 3.6 |
|  20/03/2022 06:54:06 | 3.4 |
|  20/03/2022 07:24:06 | 3.5 |
|  20/03/2022 07:54:06 | 3.3 |
|  20/03/2022 08:24:06 | 3 |
|  20/03/2022 08:54:06 | 3.2 |
|  20/03/2022 09:24:06 | 3.5 |
|  20/03/2022 09:54:06 | 4.6 |
|  20/03/2022 10:24:06 | 5.5 |
|  20/03/2022 10:54:06 | 6.9 |
|  20/03/2022 11:24:06 | 7.6 |
|  20/03/2022 11:54:06 | 8 |
|  20/03/2022 12:24:06 | 8.8 |
|  20/03/2022 12:54:06 | 7.6 |
|  20/03/2022 13:24:06 | 8.1 |
|  20/03/2022 13:54:06 | 9.3 |
|  20/03/2022 14:24:06 | 10.3 |
|  20/03/2022 14:54:06 | 9.6 |
|  20/03/2022 15:24:06 | 9.4 |
|  20/03/2022 15:54:06 | 9.9 |
|  20/03/2022 16:24:06 | 8.7 |
|  20/03/2022 16:54:06 | 9.7 |
|  20/03/2022 17:24:06 | 10 |
|  20/03/2022 17:54:06 | 9 |
|  20/03/2022 18:24:06 | 8.5 |
|  20/03/2022 18:54:06 | 7.8 |
|  20/03/2022 19:24:06 | 7.5 |
|  20/03/2022 19:54:06 | 6.8 |
|  20/03/2022 20:24:06 | 6 |
|  20/03/2022 20:54:06 | 5.2 |
|  20/03/2022 21:24:06 | 4.6 |
|  20/03/2022 21:54:06 | 4.2 |
|  20/03/2022 22:24:06 | 3.8 |
|  20/03/2022 22:54:06 | 3.6 |
|  20/03/2022 23:24:06 | 3.2 |
|  20/03/2022 23:54:06 | 3 |
|  21/03/2022 00:24:06 | 2.9 |
|  21/03/2022 00:54:06 | 2.6 |
|  21/03/2022 01:24:06 | 2.2 |
|  21/03/2022 01:54:06 | 2.3 |
|  21/03/2022 02:24:06 | 2.2 |
|  21/03/2022 02:54:06 | 2.6 |
|  21/03/2022 03:24:06 | 3.1 |
|  21/03/2022 03:54:06 | 2.1 |
|  21/03/2022 04:24:06 | 1.6 |
|  21/03/2022 04:54:06 | 1.9 |
|  21/03/2022 05:24:06 | 1.2 |
|  21/03/2022 05:54:06 | 1.1 |
|  21/03/2022 06:24:06 | 1.3 |
|  21/03/2022 06:54:06 | 1.4 |
|  21/03/2022 07:24:06 | 1.5 |
|  21/03/2022 07:54:06 | 1.5 |
|  21/03/2022 08:24:06 | 1.4 |
|  21/03/2022 08:54:06 | 1.4 |
|  21/03/2022 09:24:06 | 1.2 |
|  21/03/2022 09:54:06 | 1.8 |
|  21/03/2022 10:24:06 | 2.1 |
|  21/03/2022 10:54:06 | 2.5 |
|  21/03/2022 11:24:06 | 3.8 |
|  21/03/2022 11:54:06 | 5.6 |
|  21/03/2022 12:24:06 | 6.9 |
|  21/03/2022 12:54:06 | 7.3 |
|  21/03/2022 13:24:06 | 8.2 |
|  21/03/2022 13:54:06 | 8.2 |
|  21/03/2022 14:24:06 | 8.6 |
|  21/03/2022 14:54:06 | 9.8 |
|  21/03/2022 15:24:06 | 10.3 |
|  21/03/2022 15:54:06 | 10.4 |
|  21/03/2022 16:24:06 | 10.8 |
|  21/03/2022 16:54:06 | 11.2 |
|  21/03/2022 17:24:06 | 10.9 |
|  21/03/2022 17:54:06 | 10.8 |
|  21/03/2022 18:24:06 | 11.5 |
|  21/03/2022 18:54:06 | 10.8 |
|  21/03/2022 19:24:06 | 10.3 |
|  21/03/2022 19:54:06 | 9.2 |
|  21/03/2022 20:24:06 | 7.7 |
|  21/03/2022 20:54:06 | 6.4 |
|  21/03/2022 21:24:06 | 5.2 |
|  21/03/2022 21:54:06 | 4.8 |
|  21/03/2022 22:24:06 | 4.3 |
|  21/03/2022 22:54:06 | 4 |
|  21/03/2022 23:24:06 | 3.7 |
|  21/03/2022 23:54:06 | 4.1 |
|  22/03/2022 00:24:06 | 4.3 |
|  22/03/2022 00:54:06 | 3.9 |
|  22/03/2022 01:24:06 | 3.8 |
|  22/03/2022 01:54:06 | 3.7 |
|  22/03/2022 02:24:06 | 2.9 |
|  22/03/2022 02:54:06 | 3.2 |
|  22/03/2022 03:24:06 | 2.6 |
|  22/03/2022 03:54:06 | 2.1 |
|  22/03/2022 04:24:06 | 2.3 |
|  22/03/2022 04:54:06 | 2 |
|  22/03/2022 05:25:06 | 1.7 |
|  22/03/2022 05:55:06 | 1.3 |
|  22/03/2022 06:25:06 | 1.9 |
|  22/03/2022 06:55:06 | 2 |
|  22/03/2022 07:25:06 | 1.5 |
|  22/03/2022 07:55:06 | 0.8 |
|  22/03/2022 08:25:06 | 0 |
|  22/03/2022 08:55:06 | 0.2 |
|  22/03/2022 09:25:06 | 1.7 |
|  22/03/2022 09:55:06 | 1.2 |
|  22/03/2022 10:25:06 | 2.4 |
|  22/03/2022 10:55:06 | 2.5 |
|  22/03/2022 11:25:06 | 4.1 |
|  22/03/2022 11:55:06 | 7.4 |
|  22/03/2022 12:25:06 | 8.5 |
|  22/03/2022 12:55:06 | 10.1 |
|  22/03/2022 13:25:06 | 11.9 |
|  22/03/2022 13:55:06 | 12 |
|  22/03/2022 14:25:06 | 12.7 |
|  22/03/2022 14:55:06 | 13.5 |
|  22/03/2022 15:25:06 | 13.3 |
|  22/03/2022 15:55:06 | 14.4 |
|  22/03/2022 16:25:06 | 15.1 |
|  22/03/2022 16:55:06 | 14.6 |
|  22/03/2022 17:25:06 | 14.4 |
|  22/03/2022 17:55:06 | 13.7 |
|  22/03/2022 18:25:06 | 13.2 |
|  22/03/2022 18:55:06 | 13 |
|  22/03/2022 19:25:06 | 12.1 |
|  22/03/2022 19:55:06 | 11.2 |
|  22/03/2022 20:25:06 | 9.2 |
|  22/03/2022 20:55:06 | 8.1 |
|  22/03/2022 21:25:06 | 7.9 |
|  22/03/2022 21:55:06 | 7.4 |
|  22/03/2022 22:25:06 | 7 |
|  22/03/2022 22:55:06 | 6.7 |
|  22/03/2022 23:25:06 | 6.7 |
|  22/03/2022 23:55:06 | 6.1 |
|  23/03/2022 00:25:06 | 5.5 |
|  23/03/2022 00:55:06 | 5.6 |
|  23/03/2022 01:25:06 | 5.6 |
|  23/03/2022 01:55:06 | 5.6 |
|  23/03/2022 02:25:06 | 5.3 |
|  23/03/2022 02:55:06 | 4.4 |
|  23/03/2022 03:25:06 | 5 |
|  23/03/2022 03:55:06 | 4.3 |
|  23/03/2022 04:25:06 | 3.8 |
|  23/03/2022 04:55:06 | 4.9 |
|  23/03/2022 05:25:06 | 3.4 |
|  23/03/2022 05:55:06 | 4.5 |
|  23/03/2022 06:25:06 | 2 |
|  23/03/2022 06:55:06 | 2.2 |
|  23/03/2022 07:25:06 | 1.8 |
|  23/03/2022 07:55:06 | 2.7 |
|  23/03/2022 08:25:06 | 2.6 |
|  23/03/2022 08:55:06 | 2.9 |
|  23/03/2022 09:25:06 | 3.5 |
|  23/03/2022 09:55:06 | 4.2 |
|  23/03/2022 10:25:06 | 4.6 |
|  23/03/2022 10:55:06 | 5.4 |
|  23/03/2022 11:25:06 | 6 |
|  23/03/2022 11:55:06 | 7 |
|  23/03/2022 12:25:06 | 7.4 |
|  23/03/2022 12:55:06 | 9.5 |
|  23/03/2022 13:25:06 | 11.5 |
|  23/03/2022 13:55:06 | 12.4 |
|  23/03/2022 14:25:06 | 14.1 |
|  23/03/2022 14:55:06 | 15.8 |
|  23/03/2022 15:25:06 | 16.8 |
|  23/03/2022 15:55:06 | 16.5 |
|  23/03/2022 16:25:06 | 17.3 |
|  23/03/2022 16:55:06 | 18.1 |
|  23/03/2022 17:25:06 | 18.5 |
|  23/03/2022 17:55:06 | 18.8 |
|  23/03/2022 18:25:06 | 17.5 |
|  23/03/2022 18:55:06 | 16.2 |
|  23/03/2022 19:25:06 | 15.9 |
|  23/03/2022 19:55:06 | 13.7 |
|  23/03/2022 20:25:06 | 12.1 |
|  23/03/2022 20:55:06 | 10.6 |
|  23/03/2022 21:25:06 | 11.2 |
|  23/03/2022 21:55:06 | 10 |
|  23/03/2022 22:25:06 | 9.7 |
|  23/03/2022 22:55:06 | 9.3 |
|  23/03/2022 23:25:06 | 8.7 |
|  23/03/2022 23:55:06 | 8.4 |
|  24/03/2022 00:25:06 | 8.4 |
|  24/03/2022 00:55:06 | 8.4 |
|  24/03/2022 01:25:06 | 8 |
|  24/03/2022 01:55:06 | 7.5 |
|  24/03/2022 02:25:06 | 7.4 |
|  24/03/2022 02:55:06 | 6.9 |
|  24/03/2022 03:25:06 | 7 |
|  24/03/2022 03:55:06 | 6.3 |
|  24/03/2022 04:25:06 | 5.7 |
|  24/03/2022 04:55:06 | 5.1 |
|  24/03/2022 05:25:06 | 5.4 |
|  24/03/2022 05:55:06 | 5.2 |
|  24/03/2022 06:25:06 | 5 |
|  24/03/2022 06:55:06 | 5 |
|  24/03/2022 07:25:06 | 4.8 |
|  24/03/2022 07:55:06 | 5 |
|  24/03/2022 08:25:06 | 6.4 |
|  24/03/2022 08:55:06 | 6.5 |
|  24/03/2022 09:25:06 | 6.3 |
|  24/03/2022 09:55:06 | 6.8 |
|  24/03/2022 10:25:06 | 7.7 |
|  24/03/2022 10:55:06 | 7.9 |
|  24/03/2022 11:25:06 | 8.8 |
|  24/03/2022 11:55:06 | 9.1 |
|  24/03/2022 12:25:06 | 9.4 |
|  24/03/2022 12:55:06 | 9.8 |
|  24/03/2022 13:25:06 | 10.3 |
|  24/03/2022 13:55:06 | 11.2 |
|  24/03/2022 14:25:06 | 14.9 |
|  24/03/2022 14:55:06 | 15 |
|  24/03/2022 15:25:06 | 16.6 |
|  24/03/2022 15:55:06 | 16.3 |
|  24/03/2022 16:25:06 | 17.5 |
|  24/03/2022 16:55:06 | 17.2 |
|  24/03/2022 17:25:06 | 17.5 |
|  24/03/2022 17:55:06 | 17.1 |
|  24/03/2022 18:25:06 | 16.5 |
|  24/03/2022 18:55:06 | 16.4 |
|  24/03/2022 19:25:06 | 16.1 |
|  24/03/2022 19:55:06 | 14.7 |
|  24/03/2022 20:25:06 | 13.8 |
|  24/03/2022 20:55:06 | 12.6 |
|  24/03/2022 21:25:06 | 12.3 |
|  24/03/2022 21:55:06 | 12.5 |
|  24/03/2022 22:25:06 | 11.3 |
|  24/03/2022 22:55:06 | 10.7 |
|  24/03/2022 23:25:06 | 11.1 |
|  24/03/2022 23:55:06 | 10.9 |
|  25/03/2022 00:25:06 | 8.8 |
|  25/03/2022 00:55:06 | 9 |
|  25/03/2022 01:25:06 | 8.2 |
|  25/03/2022 01:55:06 | 8.4 |
|  25/03/2022 02:25:06 | 9.1 |
|  25/03/2022 02:55:06 | 7.9 |
|  25/03/2022 03:25:06 | 7.5 |
|  25/03/2022 03:55:06 | 7.5 |
|  25/03/2022 04:25:06 | 7.3 |
|  25/03/2022 04:55:06 | 6.3 |
|  25/03/2022 05:25:06 | 6.3 |
|  25/03/2022 05:55:06 | 7.4 |
|  25/03/2022 06:25:06 | 5.5 |
|  25/03/2022 06:55:06 | 6.3 |
|  25/03/2022 07:25:06 | 6.1 |
|  25/03/2022 07:55:06 | 6.2 |
|  25/03/2022 08:25:06 | 5.6 |
|  25/03/2022 08:55:06 | 6 |
|  25/03/2022 09:25:06 | 5.1 |
|  25/03/2022 09:55:06 | 5.8 |
|  25/03/2022 10:25:06 | 7.4 |
|  25/03/2022 10:55:06 | 6.6 |
|  25/03/2022 11:25:06 | 8.8 |
|  25/03/2022 11:55:06 | 10.1 |
|  25/03/2022 12:25:06 | 11.5 |
|  25/03/2022 12:55:06 | 12.9 |
|  25/03/2022 13:25:06 | 14.5 |
|  25/03/2022 13:55:06 | 15 |
|  25/03/2022 14:25:06 | 15.9 |
|  25/03/2022 14:55:06 | 16.1 |
|  25/03/2022 15:25:06 | 17.2 |
|  25/03/2022 15:55:06 | 17.4 |
|  25/03/2022 16:25:06 | 17.1 |
|  25/03/2022 16:55:06 | 16.9 |
|  25/03/2022 17:25:06 | 17.8 |
|  25/03/2022 17:55:06 | 17.4 |
|  25/03/2022 18:25:06 | 17.2 |
|  25/03/2022 18:55:06 | 17.1 |
|  25/03/2022 19:25:06 | 16.6 |
|  25/03/2022 19:55:06 | 15.9 |
|  25/03/2022 20:25:06 | 14.9 |
|  25/03/2022 20:55:06 | 13.2 |
|  25/03/2022 21:25:06 | 12.3 |
|  25/03/2022 21:55:06 | 11.8 |
|  25/03/2022 22:25:06 | 10.7 |
|  25/03/2022 22:55:06 | 10.4 |
|  25/03/2022 23:25:06 | 10.3 |
|  25/03/2022 23:55:06 | 9.4 |
|  26/03/2022 00:25:06 | 8.5 |
|  26/03/2022 00:55:06 | 8.9 |
|  26/03/2022 01:25:06 | 7.7 |
|  26/03/2022 01:55:06 | 7.6 |
|  26/03/2022 02:25:06 | 7.3 |
|  26/03/2022 02:55:06 | 7.7 |
|  26/03/2022 03:25:06 | 7.5 |
|  26/03/2022 03:55:06 | 8.1 |
|  26/03/2022 04:25:06 | 6.5 |
|  26/03/2022 04:55:06 | 5.8 |
|  26/03/2022 05:25:06 | 5.3 |
|  26/03/2022 05:55:06 | 5.2 |
|  26/03/2022 06:25:06 | 6 |
|  26/03/2022 06:55:06 | 5.4 |
|  26/03/2022 07:25:06 | 4.4 |
|  26/03/2022 07:55:06 | 3.6 |
|  26/03/2022 08:25:06 | 3.6 |
|  26/03/2022 08:55:06 | 3.8 |
|  26/03/2022 09:25:06 | 4.8 |
|  26/03/2022 09:55:06 | 5.8 |
|  26/03/2022 10:25:06 | 9.6 |
|  26/03/2022 10:55:06 | 8.7 |
|  26/03/2022 11:25:06 | 10.5 |
|  26/03/2022 11:55:06 | 10.9 |
|  26/03/2022 12:25:06 | 11.5 |
|  26/03/2022 12:55:06 | 12.8 |
|  26/03/2022 13:25:06 | 12.6 |
|  26/03/2022 13:55:06 | 14.6 |
|  26/03/2022 14:25:06 | 15.2 |
|  26/03/2022 14:55:06 | 15.9 |
|  26/03/2022 15:25:06 | 16.9 |
|  26/03/2022 15:55:06 | 17.7 |
|  26/03/2022 16:25:06 | 17.3 |
|  26/03/2022 16:55:06 | 18.6 |
|  26/03/2022 17:25:06 | 18.4 |
|  26/03/2022 17:55:06 | 18.3 |
|  26/03/2022 18:25:06 | 15.6 |
|  26/03/2022 18:55:06 | 16.4 |
|  26/03/2022 19:25:06 | 15.4 |
|  26/03/2022 19:55:06 | 14.4 |
|  26/03/2022 20:25:06 | 13 |
|  26/03/2022 20:55:06 | 11.7 |
|  26/03/2022 21:25:06 | 10.9 |
|  26/03/2022 21:55:06 | 10.5 |
|  26/03/2022 22:25:06 | 10.4 |
|  26/03/2022 22:55:06 | 10.2 |
|  26/03/2022 23:25:06 | 8.9 |
|  26/03/2022 23:55:06 | 7.4 |
|  27/03/2022 00:25:06 | 6.4 |
|  27/03/2022 00:55:06 | 6.2 |
|  27/03/2022 01:25:06 | 6.6 |
|  27/03/2022 01:55:06 | 6.7 |
|  27/03/2022 02:25:06 | 6.8 |
|  27/03/2022 02:55:06 | 6.4 |
|  27/03/2022 03:25:06 | 6.4 |
|  27/03/2022 03:55:06 | 6.3 |
|  27/03/2022 04:25:06 | 6.3 |
|  27/03/2022 04:55:06 | 5.6 |
|  27/03/2022 05:25:06 | 5.7 |
|  27/03/2022 05:55:06 | 5.6 |
|  27/03/2022 06:25:06 | 5.6 |
|  27/03/2022 06:55:06 | 5.3 |
|  27/03/2022 07:25:06 | 5.1 |
|  27/03/2022 07:55:06 | 5 |
|  27/03/2022 08:25:06 | 4.8 |
|  27/03/2022 08:55:06 | 4.5 |
|  27/03/2022 09:25:06 | 4.4 |
|  27/03/2022 09:55:06 | 4.6 |
|  27/03/2022 10:25:06 | 4.2 |
|  27/03/2022 10:55:06 | 4.7 |
|  27/03/2022 11:25:06 | 5 |
|  27/03/2022 11:55:06 | 12.5 |
|  27/03/2022 12:25:06 | 15.8 |
|  27/03/2022 12:55:06 | 17.2 |
|  27/03/2022 13:25:06 | 17 |
|  27/03/2022 13:55:06 | 18 |
|  27/03/2022 14:25:06 | 18.7 |
|  27/03/2022 14:55:06 | 18.9 |
|  27/03/2022 15:25:06 | 18.9 |
|  27/03/2022 15:55:06 | 18.9 |
|  27/03/2022 16:25:06 | 18.6 |
|  27/03/2022 16:55:06 | 18.5 |
|  27/03/2022 17:25:06 | 18.4 |
|  27/03/2022 17:55:06 | 17.9 |
|  27/03/2022 18:25:06 | 17 |
|  27/03/2022 18:55:06 | 15.6 |
|  27/03/2022 19:25:06 | 14.4 |
|  27/03/2022 19:55:06 | 13.4 |
|  27/03/2022 20:25:06 | 9.2 |
|  27/03/2022 20:55:06 | 6.8 |
|  27/03/2022 21:25:06 | 6.1 |
|  27/03/2022 21:55:06 | 6.1 |
|  27/03/2022 22:25:06 | 6 |
|  27/03/2022 22:55:06 | 5.9 |
|  27/03/2022 23:25:06 | 5.7 |
|  27/03/2022 23:55:06 | 5.5 |
|  28/03/2022 00:25:06 | 4.9 |
|  28/03/2022 00:55:06 | 4.2 |
|  28/03/2022 01:25:06 | 4 |
|  28/03/2022 01:55:06 | 3.5 |
|  28/03/2022 02:25:06 | 3 |
|  28/03/2022 02:55:06 | 2.8 |
|  28/03/2022 03:25:06 | 3 |
|  28/03/2022 03:55:06 | 2.3 |
|  28/03/2022 04:25:06 | 2.3 |
|  28/03/2022 04:55:06 | 2.7 |
|  28/03/2022 05:25:06 | 3.1 |
|  28/03/2022 05:55:06 | 2.8 |
|  28/03/2022 06:25:06 | 1.6 |
|  28/03/2022 06:55:06 | 2.1 |
|  28/03/2022 07:25:06 | 2.8 |
|  28/03/2022 07:55:06 | 4.2 |
|  28/03/2022 08:25:06 | 5.9 |
|  28/03/2022 08:55:06 | 5.7 |
|  28/03/2022 09:25:06 | 7.9 |
|  28/03/2022 09:55:06 | 10 |
|  28/03/2022 10:25:06 | 11.4 |
|  28/03/2022 10:55:06 | 12.4 |
|  28/03/2022 11:25:06 | 13.9 |
|  28/03/2022 11:55:06 | 14 |
|  28/03/2022 12:25:06 | 14.1 |
|  28/03/2022 12:55:06 | 14.1 |
|  28/03/2022 13:25:06 | 14.9 |
|  28/03/2022 13:55:06 | 14.6 |
|  28/03/2022 14:25:06 | 13.8 |
|  28/03/2022 14:55:06 | 14.8 |
|  28/03/2022 15:25:06 | 15.6 |
|  28/03/2022 15:55:06 | 15 |
|  28/03/2022 16:25:06 | 14.8 |
|  28/03/2022 16:55:06 | 14.7 |
|  28/03/2022 17:25:06 | 13.8 |
|  28/03/2022 17:55:06 | 11.4 |
|  28/03/2022 18:25:06 | 10.6 |
|  28/03/2022 18:55:06 | 9.8 |
|  28/03/2022 19:25:06 | 9.9 |
|  28/03/2022 19:55:06 | 9.8 |
|  28/03/2022 20:25:06 | 9.1 |
|  28/03/2022 20:55:06 | 8 |
|  28/03/2022 21:25:06 | 7.9 |
|  28/03/2022 21:55:06 | 7.3 |
|  28/03/2022 22:25:06 | 7.3 |
|  28/03/2022 22:55:06 | 7.2 |
|  28/03/2022 23:25:06 | 5.9 |
|  28/03/2022 23:55:06 | 6.1 |
|  29/03/2022 00:25:06 | 6.2 |
|  29/03/2022 00:55:06 | 4.3 |
|  29/03/2022 01:25:06 | 4.9 |
|  29/03/2022 01:55:06 | 4.5 |
|  29/03/2022 02:25:06 | 4.1 |
|  29/03/2022 02:55:06 | 4.1 |
|  29/03/2022 03:25:06 | 3.1 |
|  29/03/2022 03:55:06 | 3.1 |
|  29/03/2022 04:25:06 | 2.6 |
|  29/03/2022 04:55:06 | 3.2 |
|  29/03/2022 05:25:06 | 2.3 |
|  29/03/2022 05:55:06 | 2.7 |
|  29/03/2022 06:25:06 | 3.3 |
|  29/03/2022 06:55:06 | 3.2 |
|  29/03/2022 07:25:06 | 3.1 |
|  29/03/2022 07:55:06 | 3.5 |
|  29/03/2022 08:25:06 | 4.7 |
|  29/03/2022 08:55:06 | 5.8 |
|  29/03/2022 09:25:06 | 5.9 |
|  29/03/2022 09:55:06 | 6 |
|  29/03/2022 10:25:06 | 6 |
|  29/03/2022 10:55:06 | 6.3 |
|  29/03/2022 11:25:06 | 6.7 |
|  29/03/2022 11:55:06 | 7.2 |
|  29/03/2022 12:25:06 | 7.6 |
|  29/03/2022 12:55:06 | 8.2 |
|  29/03/2022 13:25:06 | 8 |
|  29/03/2022 13:55:06 | 8.3 |
|  29/03/2022 14:25:06 | 8.5 |
|  29/03/2022 14:55:06 | 8.6 |
|  29/03/2022 15:25:06 | 8.3 |
|  29/03/2022 15:55:06 | 8.3 |
|  29/03/2022 16:25:06 | 8 |
|  29/03/2022 16:55:06 | 6.7 |
|  29/03/2022 17:25:06 | 5.6 |
|  29/03/2022 17:55:06 | 4.6 |
|  29/03/2022 18:25:06 | 4.4 |
|  29/03/2022 18:55:06 | 4 |
|  29/03/2022 19:25:06 | 3.8 |
|  29/03/2022 19:55:06 | 3.5 |
|  29/03/2022 20:25:06 | 3.2 |
|  29/03/2022 20:55:06 | 3.3 |
|  29/03/2022 21:25:06 | 3.4 |
|  29/03/2022 21:55:06 | 3.2 |
|  29/03/2022 22:25:06 | 3.3 |
|  29/03/2022 22:55:06 | 3.4 |
|  29/03/2022 23:25:06 | 3.4 |
|  29/03/2022 23:55:06 | 3.3 |
|  30/03/2022 00:25:06 | 3.2 |
|  30/03/2022 00:55:06 | 3.2 |
|  30/03/2022 01:25:06 | 3.1 |
|  30/03/2022 01:55:06 | 3 |
|  30/03/2022 02:25:06 | 2.9 |
|  30/03/2022 02:55:06 | 2.7 |
|  30/03/2022 03:25:06 | 2.6 |
|  30/03/2022 03:55:06 | 2.4 |
|  30/03/2022 04:25:06 | 2.2 |
|  30/03/2022 04:55:06 | 1.6 |
|  30/03/2022 05:25:06 | 0.9 |
|  30/03/2022 05:55:06 | 0.7 |
|  30/03/2022 06:25:06 | 1.1 |
|  30/03/2022 06:55:06 | 1.1 |
|  30/03/2022 07:25:06 | 1.1 |
|  30/03/2022 07:55:06 | 1.3 |
|  30/03/2022 08:25:06 | 1.5 |
|  30/03/2022 08:55:06 | 2.1 |
|  30/03/2022 09:25:06 | 2.8 |
|  30/03/2022 09:55:06 | 2.8 |
|  30/03/2022 10:25:06 | 4.8 |
|  30/03/2022 10:55:06 | 5.3 |
|  30/03/2022 11:25:06 | 4.5 |
|  30/03/2022 11:55:06 | 5.8 |
|  30/03/2022 12:25:06 | 4.1 |
|  30/03/2022 12:55:06 | 7.1 |
|  30/03/2022 13:25:06 | 6.6 |
|  30/03/2022 13:55:06 | 6.1 |
|  30/03/2022 14:25:06 | 7.5 |
|  30/03/2022 14:55:06 | 4.8 |
|  30/03/2022 15:25:06 | 6.3 |
|  30/03/2022 15:55:06 | 4.8 |
|  30/03/2022 16:25:06 | 4.9 |
|  30/03/2022 16:55:06 | 3.9 |
|  30/03/2022 17:25:06 | 3.8 |
|  30/03/2022 17:55:06 | 3 |
|  30/03/2022 18:25:06 | 3.6 |
|  30/03/2022 18:55:06 | 0.9 |
|  30/03/2022 19:25:06 | 0.9 |
|  30/03/2022 19:55:06 | 1.6 |
|  30/03/2022 20:25:06 | 1.4 |
|  30/03/2022 20:55:06 | 1.7 |
|  30/03/2022 21:25:06 | 1.4 |
|  30/03/2022 21:55:06 | 1.8 |
|  30/03/2022 22:25:06 | 1.7 |
|  30/03/2022 22:55:06 | 1.2 |
|  30/03/2022 23:25:06 | 1.4 |
|  30/03/2022 23:55:06 | 1 |
|  31/03/2022 00:25:06 | 1.3 |
|  31/03/2022 00:55:06 | 1.2 |
|  31/03/2022 01:25:06 | 0.6 |
|  31/03/2022 01:55:06 | 0.2 |
|  31/03/2022 02:25:06 | 0.4 |
|  31/03/2022 02:55:06 | 0.3 |
|  31/03/2022 03:25:06 | 0.4 |
|  31/03/2022 03:55:06 | 0.2 |
|  31/03/2022 04:25:06 | 0.1 |
|  31/03/2022 04:55:06 | 0.1 |
|  31/03/2022 05:25:06 | -0.1 |
|  31/03/2022 05:55:06 | -0.1 |
|  31/03/2022 06:25:06 | -0.7 |
|  31/03/2022 06:55:06 | -0.4 |
|  31/03/2022 07:25:06 | -0.1 |
|  31/03/2022 07:55:06 | 0.7 |
|  31/03/2022 08:25:06 | 0.9 |
|  31/03/2022 08:55:06 | 2.2 |
|  31/03/2022 09:25:06 | 3.1 |
|  31/03/2022 09:55:06 | 4.2 |
|  31/03/2022 10:25:06 | 5 |
|  31/03/2022 10:55:06 | 4.4 |
|  31/03/2022 11:25:06 | 4.5 |
|  31/03/2022 11:55:06 | 5.2 |
|  31/03/2022 12:25:06 | 5.5 |
|  31/03/2022 12:55:06 | 7.8 |
|  31/03/2022 13:25:06 | 7.4 |
|  31/03/2022 13:55:06 | 7.6 |
|  31/03/2022 14:25:06 | 7 |
|  31/03/2022 14:55:06 | 8.9 |
|  31/03/2022 15:25:06 | 5.5 |
|  31/03/2022 15:55:06 | 8.1 |
|  31/03/2022 16:25:06 | 6.5 |
|  31/03/2022 16:55:06 | 7.9 |
|  31/03/2022 17:25:06 | 5 |
|  31/03/2022 17:55:06 | 5.1 |
|  31/03/2022 18:25:06 | 4.9 |
|  31/03/2022 18:55:06 | 5.1 |
|  31/03/2022 19:25:06 | 4 |
|  31/03/2022 19:55:06 | 3.4 |
|  31/03/2022 20:25:06 | 3 |
|  31/03/2022 20:55:06 | 2.8 |
|  31/03/2022 21:25:06 | 2.4 |
|  31/03/2022 21:55:06 | 2.2 |
|  31/03/2022 22:25:06 | 1.8 |
|  31/03/2022 22:55:06 | 1.6 |
|  31/03/2022 23:25:06 | 1.3 |
|  31/03/2022 23:55:06 | 0.6 |